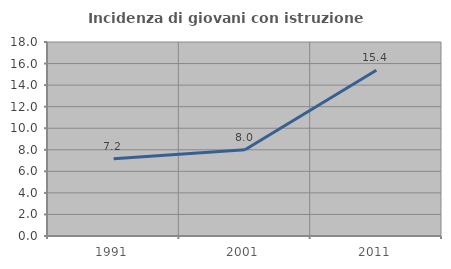
| Category | Incidenza di giovani con istruzione universitaria |
|---|---|
| 1991.0 | 7.172 |
| 2001.0 | 8 |
| 2011.0 | 15.385 |